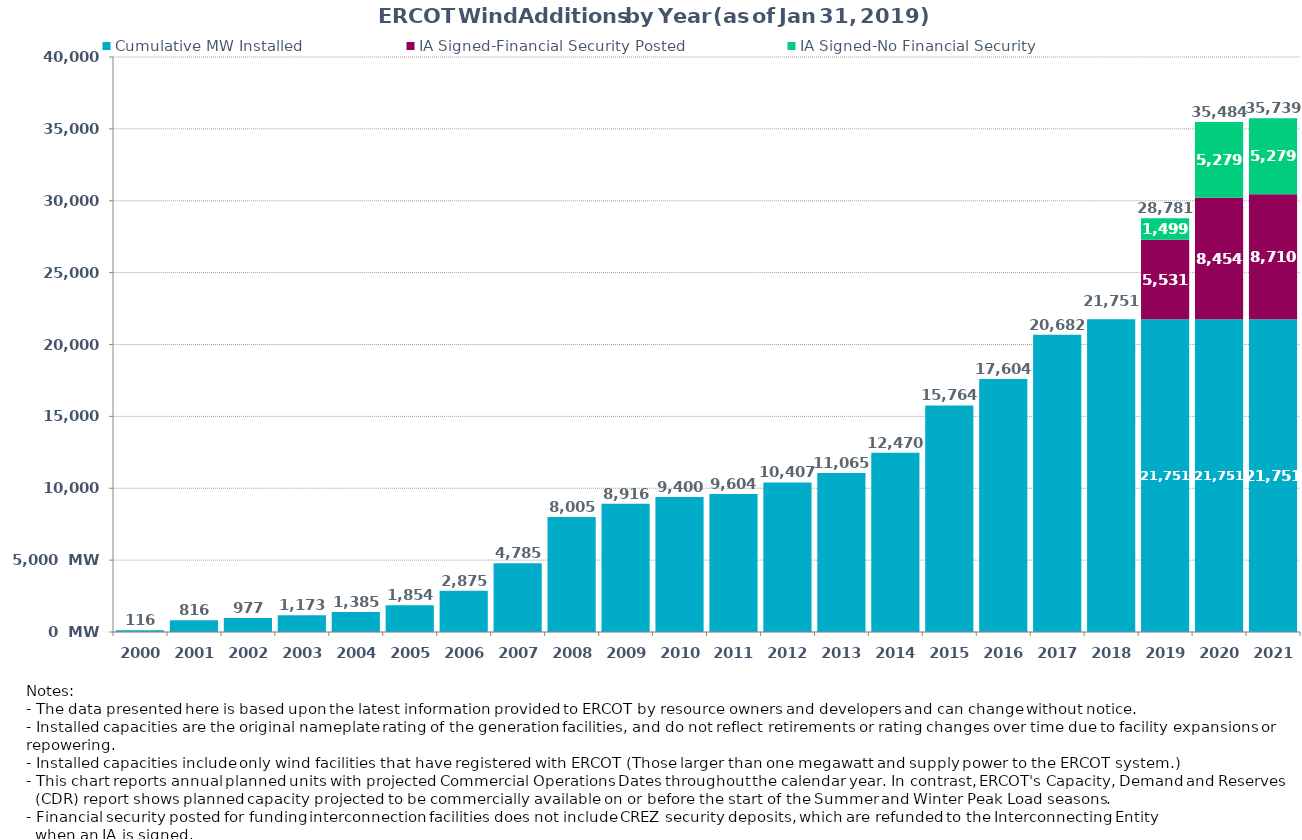
| Category | Cumulative MW Installed | IA Signed-Financial Security Posted  | IA Signed-No Financial Security  | Cumulative Installed and Planned |
|---|---|---|---|---|
| 2000.0 | 116 | 0 | 0 | 116 |
| 2001.0 | 816 | 0 | 0 | 816 |
| 2002.0 | 977 | 0 | 0 | 977 |
| 2003.0 | 1173 | 0 | 0 | 1173 |
| 2004.0 | 1385 | 0 | 0 | 1385 |
| 2005.0 | 1854 | 0 | 0 | 1854 |
| 2006.0 | 2875 | 0 | 0 | 2875 |
| 2007.0 | 4785 | 0 | 0 | 4785 |
| 2008.0 | 8005 | 0 | 0 | 8005 |
| 2009.0 | 8916 | 0 | 0 | 8916 |
| 2010.0 | 9400 | 0 | 0 | 9400 |
| 2011.0 | 9604 | 0 | 0 | 9604 |
| 2012.0 | 10407 | 0 | 0 | 10407 |
| 2013.0 | 11065 | 0 | 0 | 11065 |
| 2014.0 | 12470 | 0 | 0 | 12470 |
| 2015.0 | 15764 | 0 | 0 | 15764 |
| 2016.0 | 17604 | 0 | 0 | 17604 |
| 2017.0 | 20682 | 0 | 0 | 20682 |
| 2018.0 | 21751 | 0 | 0 | 21751 |
| 2019.0 | 21751 | 5530.54 | 1499 | 28780.54 |
| 2020.0 | 21751 | 8454.25 | 5278.7 | 35483.95 |
| 2021.0 | 21751 | 8709.55 | 5278.7 | 35739.25 |